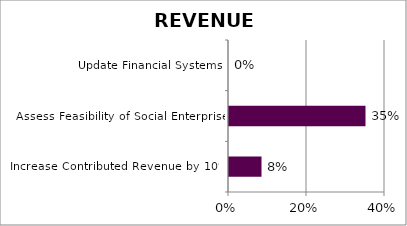
| Category | Series 0 |
|---|---|
| Increase Contributed Revenue by 10% | 0.083 |
| Assess Feasibility of Social Enterprise | 0.35 |
| Update Financial Systems | 0 |